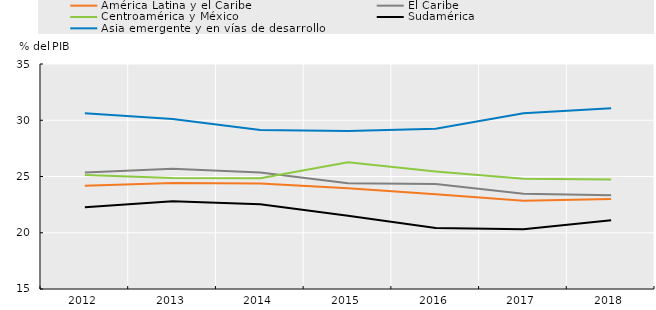
| Category | América Latina y el Caribe | El Caribe | Centroamérica y México | Sudamérica | Asia emergente y en vías de desarrollo |
|---|---|---|---|---|---|
| 2012.0 | 24.18 | 25.357 | 25.139 | 22.258 | 30.629 |
| 2013.0 | 24.413 | 25.685 | 24.859 | 22.794 | 30.11 |
| 2014.0 | 24.388 | 25.351 | 24.846 | 22.532 | 29.128 |
| 2015.0 | 23.963 | 24.392 | 26.262 | 21.507 | 29.044 |
| 2016.0 | 23.418 | 24.333 | 25.452 | 20.415 | 29.249 |
| 2017.0 | 22.836 | 23.473 | 24.805 | 20.315 | 30.624 |
| 2018.0 | 22.996 | 23.332 | 24.738 | 21.12 | 31.056 |